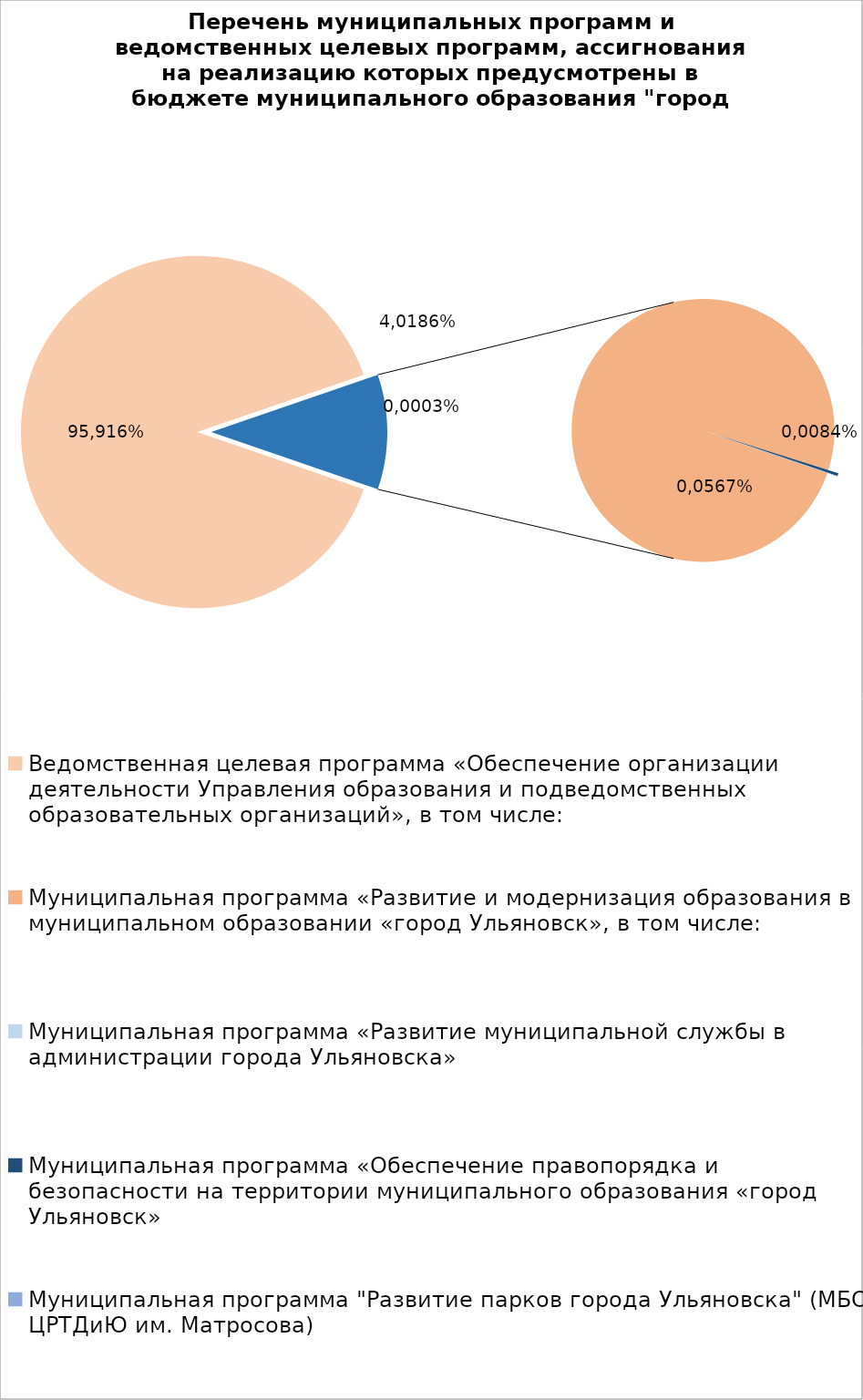
| Category | Series 0 |
|---|---|
| Ведомственная целевая программа «Обеспечение организации деятельности Управления образования и подведомственных образовательных организаций», в том числе: | 6828341.78 |
| Муниципальная программа «Развитие и модернизация образования в муниципальном образовании «город Ульяновск», в том числе: | 801366.05 |
| Муниципальная программа «Развитие муниципальной службы в администрации города Ульяновска» | 14.3 |
| Муниципальная программа «Обеспечение правопорядка и безопасности на территории муниципального образования «город Ульяновск» | 2700 |
| Муниципальная программа "Развитие парков города Ульяновска" (МБОУ ЦРТДиЮ им. Матросова) | 400 |